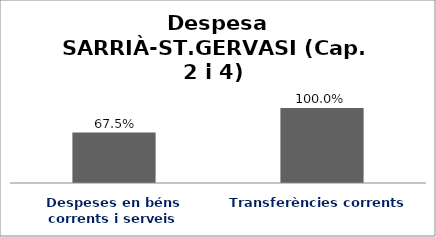
| Category | Series 0 |
|---|---|
| Despeses en béns corrents i serveis | 0.675 |
| Transferències corrents | 1 |